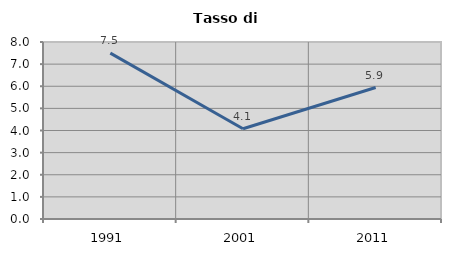
| Category | Tasso di disoccupazione   |
|---|---|
| 1991.0 | 7.499 |
| 2001.0 | 4.077 |
| 2011.0 | 5.942 |